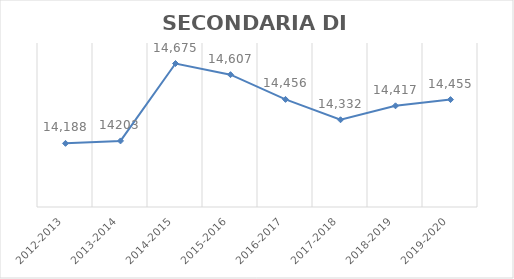
| Category | SECONDARIA DI 2°  |
|---|---|
| 2012-2013 | 14188 |
| 2013-2014 | 14203 |
| 2014-2015 | 14675 |
| 2015-2016 | 14607 |
| 2016-2017 | 14456 |
| 2017-2018 | 14332 |
| 2018-2019 | 14417 |
| 2019-2020 | 14455 |